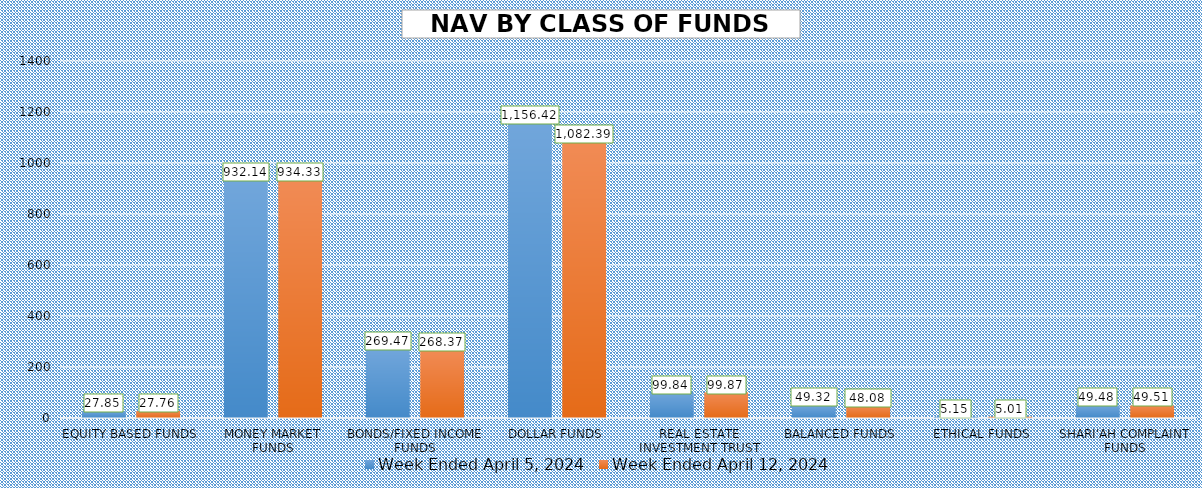
| Category | Week Ended April 5, 2024 | Week Ended April 12, 2024 |
|---|---|---|
| EQUITY BASED FUNDS | 27.852 | 27.76 |
| MONEY MARKET FUNDS | 932.135 | 934.335 |
| BONDS/FIXED INCOME FUNDS | 269.472 | 268.372 |
| DOLLAR FUNDS | 1156.417 | 1082.391 |
| REAL ESTATE INVESTMENT TRUST | 99.837 | 99.87 |
| BALANCED FUNDS | 49.32 | 48.079 |
| ETHICAL FUNDS | 5.149 | 5.005 |
| SHARI'AH COMPLAINT FUNDS | 49.48 | 49.51 |